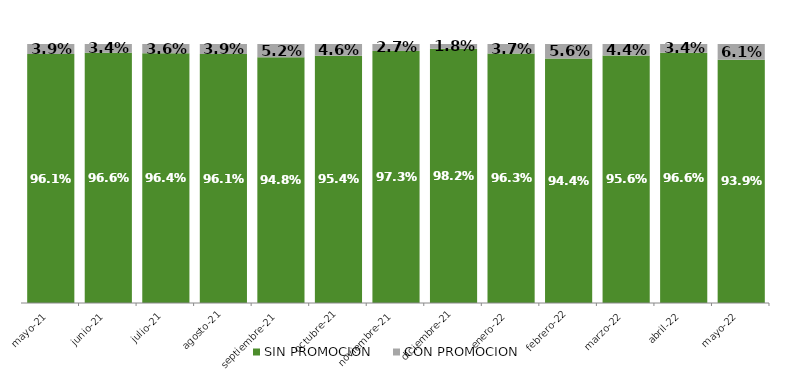
| Category | SIN PROMOCION   | CON PROMOCION   |
|---|---|---|
| 2021-05-01 | 0.961 | 0.039 |
| 2021-06-01 | 0.966 | 0.034 |
| 2021-07-01 | 0.964 | 0.036 |
| 2021-08-01 | 0.961 | 0.039 |
| 2021-09-01 | 0.948 | 0.052 |
| 2021-10-01 | 0.954 | 0.046 |
| 2021-11-01 | 0.973 | 0.027 |
| 2021-12-01 | 0.982 | 0.018 |
| 2022-01-01 | 0.963 | 0.037 |
| 2022-02-01 | 0.944 | 0.056 |
| 2022-03-01 | 0.956 | 0.044 |
| 2022-04-01 | 0.966 | 0.034 |
| 2022-05-01 | 0.939 | 0.061 |